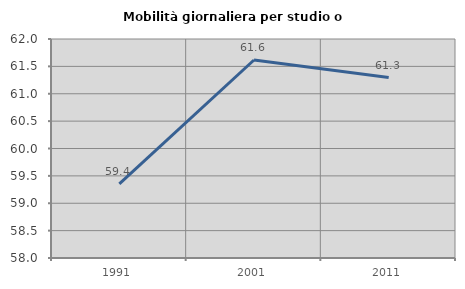
| Category | Mobilità giornaliera per studio o lavoro |
|---|---|
| 1991.0 | 59.353 |
| 2001.0 | 61.616 |
| 2011.0 | 61.297 |